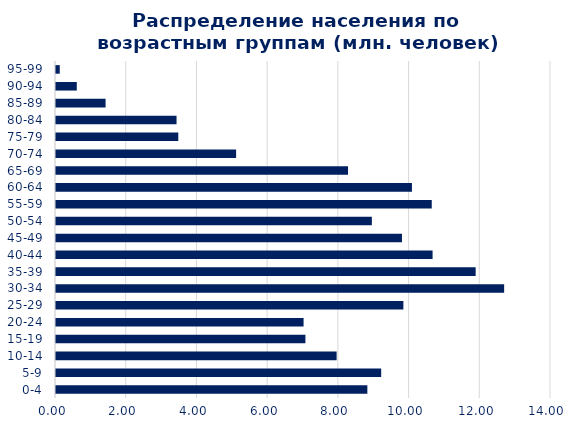
| Category |  Население  |
|---|---|
| 0-4 | 8.806 |
| 5-9 | 9.197 |
| 10-14 | 7.937 |
| 15-19 | 7.054 |
| 20-24 | 7.002 |
| 25-29 | 9.825 |
| 30-34 | 12.675 |
| 35-39 | 11.869 |
| 40-44 | 10.651 |
| 45-49 | 9.785 |
| 50-54 | 8.933 |
| 55-59 | 10.627 |
| 60-64 | 10.067 |
| 65-69 | 8.259 |
| 70-74 | 5.094 |
| 75-79 | 3.459 |
| 80-84 | 3.409 |
| 85-89 | 1.402 |
| 90-94 | 0.588 |
| 95-99 | 0.106 |